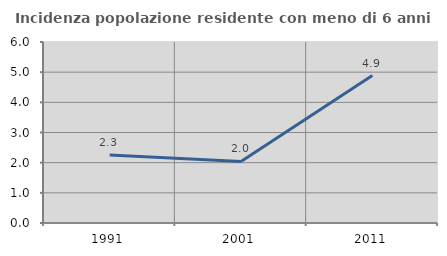
| Category | Incidenza popolazione residente con meno di 6 anni |
|---|---|
| 1991.0 | 2.258 |
| 2001.0 | 2.041 |
| 2011.0 | 4.887 |